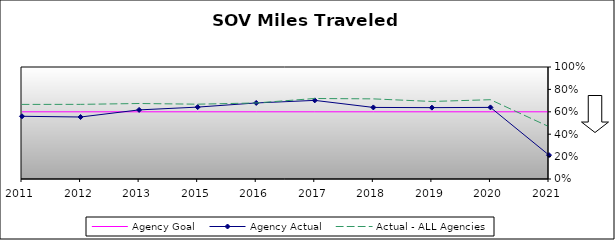
| Category | Agency Goal | Agency Actual | Actual - ALL Agencies |
|---|---|---|---|
| 2011.0 | 0.6 | 0.56 | 0.666 |
| 2012.0 | 0.6 | 0.554 | 0.666 |
| 2013.0 | 0.6 | 0.617 | 0.674 |
| 2015.0 | 0.6 | 0.642 | 0.668 |
| 2016.0 | 0.6 | 0.679 | 0.679 |
| 2017.0 | 0.6 | 0.702 | 0.719 |
| 2018.0 | 0.6 | 0.639 | 0.715 |
| 2019.0 | 0.6 | 0.637 | 0.692 |
| 2020.0 | 0.6 | 0.639 | 0.708 |
| 2021.0 | 0.6 | 0.213 | 0.467 |